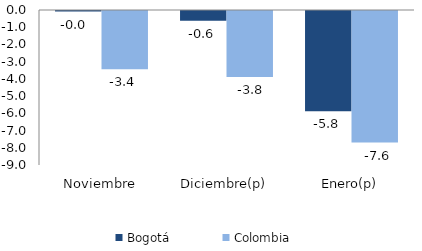
| Category | Bogotá | Colombia |
|---|---|---|
| Noviembre | -0.031 | -3.382 |
| Diciembre(p) | -0.573 | -3.838 |
| Enero(p) | -5.826 | -7.642 |